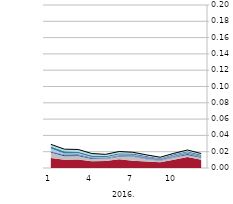
| Category | ПСС |
|---|---|
| 0 | 0.029 |
| 1 | 0.023 |
| 2 | 0.023 |
| 3 | 0.018 |
| 4 | 0.017 |
| 5 | 0.02 |
| 6 | 0.019 |
| 7 | 0.016 |
| 8 | 0.013 |
| 9 | 0.018 |
| 10 | 0.022 |
| 11 | 0.018 |